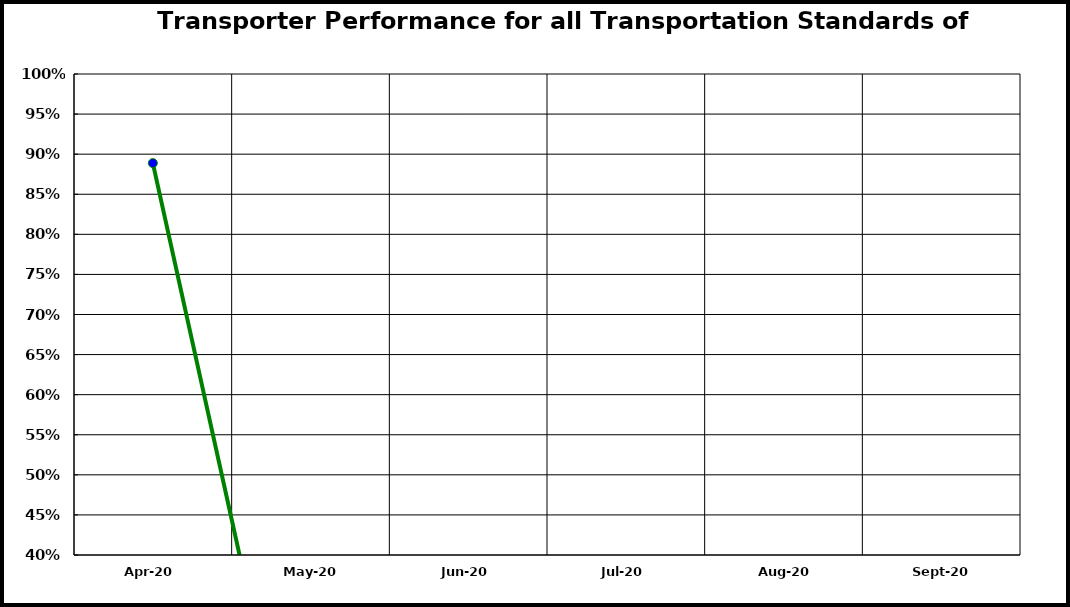
| Category | Performance |
|---|---|
| 2020-04-01 | 0.889 |
| 2020-05-01 | 0 |
| 2020-06-01 | 0 |
| 2020-07-01 | 0 |
| 2020-08-01 | 0 |
| 2020-09-01 | 0 |